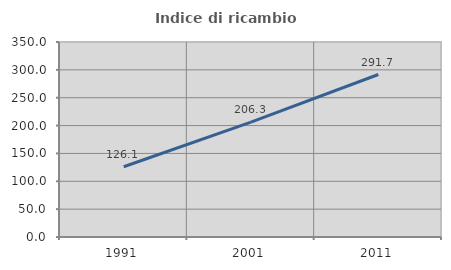
| Category | Indice di ricambio occupazionale  |
|---|---|
| 1991.0 | 126.087 |
| 2001.0 | 206.25 |
| 2011.0 | 291.667 |